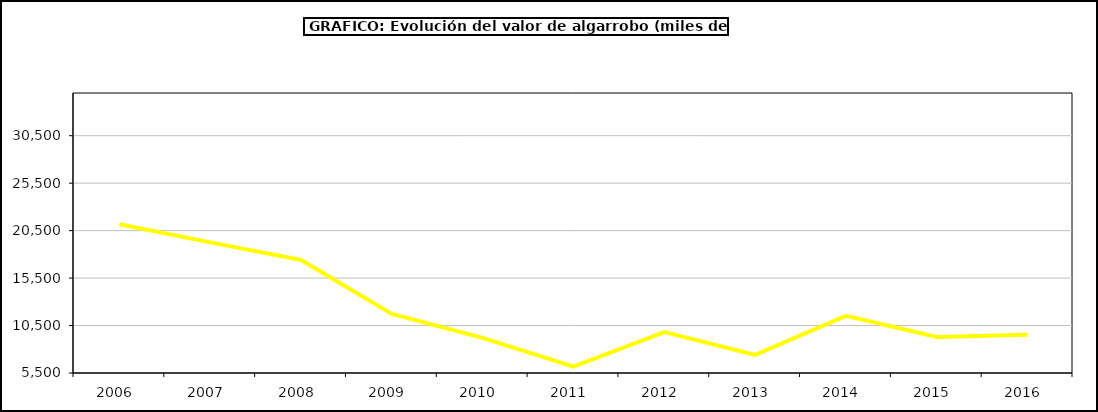
| Category | producción |
|---|---|
| 2006.0 | 21170.578 |
| 2007.0 | 19261.476 |
| 2008.0 | 17411.688 |
| 2009.0 | 11720.401 |
| 2010.0 | 9197.132 |
| 2011.0 | 6163.828 |
| 2012.0 | 9804.883 |
| 2013.0 | 7410.909 |
| 2014.0 | 11518 |
| 2015.0 | 9297 |
| 2016.0 | 9540 |